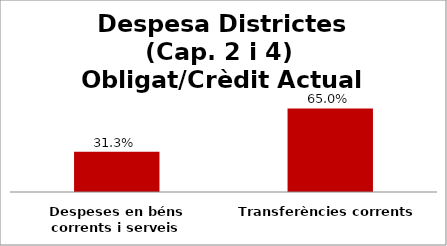
| Category | Series 0 |
|---|---|
| Despeses en béns corrents i serveis | 0.313 |
| Transferències corrents | 0.65 |